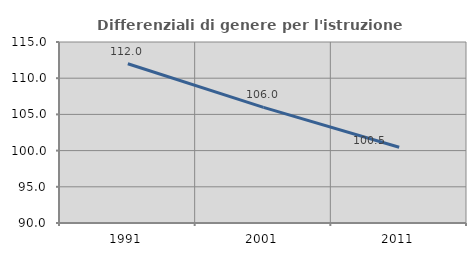
| Category | Differenziali di genere per l'istruzione superiore |
|---|---|
| 1991.0 | 111.997 |
| 2001.0 | 105.979 |
| 2011.0 | 100.461 |